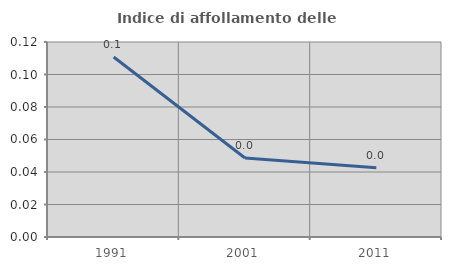
| Category | Indice di affollamento delle abitazioni  |
|---|---|
| 1991.0 | 0.111 |
| 2001.0 | 0.049 |
| 2011.0 | 0.043 |